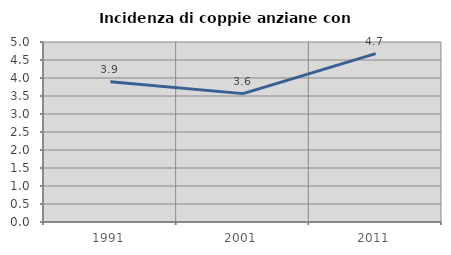
| Category | Incidenza di coppie anziane con figli |
|---|---|
| 1991.0 | 3.894 |
| 2001.0 | 3.566 |
| 2011.0 | 4.676 |